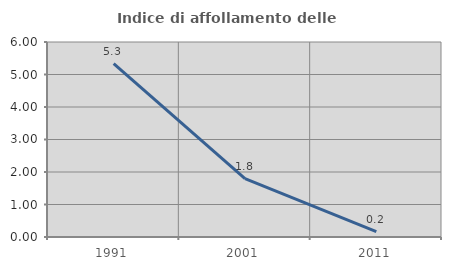
| Category | Indice di affollamento delle abitazioni  |
|---|---|
| 1991.0 | 5.331 |
| 2001.0 | 1.794 |
| 2011.0 | 0.164 |